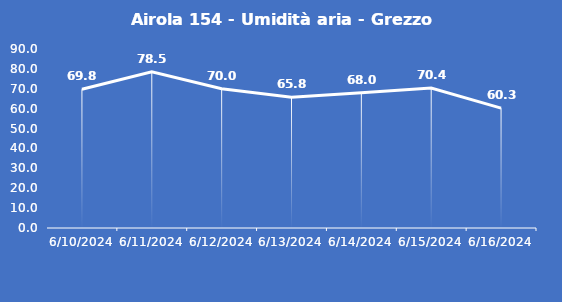
| Category | Airola 154 - Umidità aria - Grezzo (%) |
|---|---|
| 6/10/24 | 69.8 |
| 6/11/24 | 78.5 |
| 6/12/24 | 70 |
| 6/13/24 | 65.8 |
| 6/14/24 | 68 |
| 6/15/24 | 70.4 |
| 6/16/24 | 60.3 |